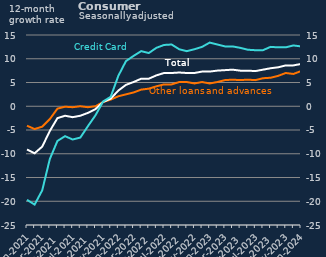
| Category | Other loans and advances | Total |
|---|---|---|
| Jan-2021 | -4.1 | -9.1 |
| Feb-2021 | -4.8 | -9.9 |
| Mar-2021 | -4.3 | -8.5 |
| Apr-2021 | -2.7 | -5.2 |
| May-2021 | -0.5 | -2.5 |
| Jun-2021 | -0.1 | -2 |
| Jul-2021 | -0.2 | -2.3 |
| Aug-2021 | 0 | -2 |
| Sep-2021 | -0.2 | -1.4 |
| Oct-2021 | 0 | -0.6 |
| Nov-2021 | 0.9 | 0.9 |
| Dec-2021 | 1.4 | 1.6 |
| Jan-2022 | 2.1 | 3.3 |
| Feb-2022 | 2.5 | 4.5 |
| Mar-2022 | 2.9 | 5.1 |
| Apr-2022 | 3.5 | 5.8 |
| May-2022 | 3.7 | 5.8 |
| Jun-2022 | 4.2 | 6.5 |
| Jul-2022 | 4.6 | 7 |
| Aug-2022 | 4.6 | 7 |
| Sep-2022 | 5.1 | 7.1 |
| Oct-2022 | 5.1 | 7 |
| Nov-2022 | 4.8 | 7 |
| Dec-2022 | 5.1 | 7.3 |
| Jan-2023 | 4.8 | 7.3 |
| Feb-2023 | 5.1 | 7.5 |
| Mar-2023 | 5.5 | 7.6 |
| Apr-2023 | 5.6 | 7.7 |
| May-2023 | 5.5 | 7.5 |
| Jun-2023 | 5.6 | 7.5 |
| Jul-2023 | 5.5 | 7.4 |
| Aug-2023 | 5.9 | 7.7 |
| Sep-2023 | 6 | 8 |
| Oct-2023 | 6.4 | 8.2 |
| Nov-2023 | 7 | 8.6 |
| Dec-2023 | 6.8 | 8.6 |
| Jan-2024 | 7.4 | 8.9 |